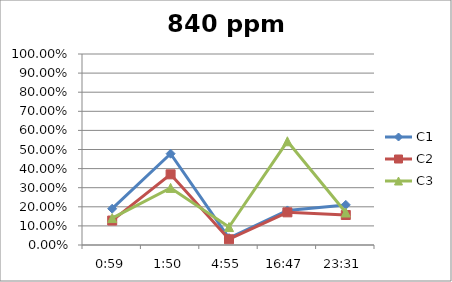
| Category | C1 | C2 | C3 |
|---|---|---|---|
| 0.0409722222222223 | 0.19 | 0.128 | 0.141 |
| 0.0763888888888889 | 0.478 | 0.37 | 0.299 |
| 0.204861111111111 | 0.036 | 0.03 | 0.094 |
| 1900-01-23 16:47:00 | 0.181 | 0.171 | 0.543 |
| 1900-01-23 23:31:00 | 0.21 | 0.157 | 0.17 |